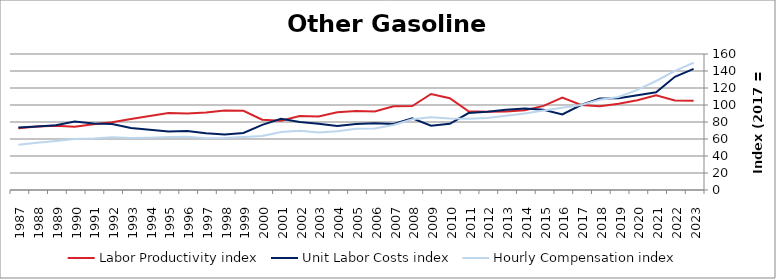
| Category | Labor Productivity index | Unit Labor Costs index | Hourly Compensation index |
|---|---|---|---|
| 2023.0 | 105.082 | 142.437 | 149.675 |
| 2022.0 | 105.326 | 133.145 | 140.236 |
| 2021.0 | 111.449 | 115.073 | 128.248 |
| 2020.0 | 105.673 | 111.532 | 117.858 |
| 2019.0 | 101.478 | 107.874 | 109.468 |
| 2018.0 | 98.571 | 107.612 | 106.075 |
| 2017.0 | 100 | 100 | 100 |
| 2016.0 | 108.844 | 88.969 | 96.837 |
| 2015.0 | 98.941 | 94.402 | 93.402 |
| 2014.0 | 93.907 | 95.83 | 89.99 |
| 2013.0 | 92.495 | 94.391 | 87.307 |
| 2012.0 | 92.034 | 92.161 | 84.819 |
| 2011.0 | 92.594 | 90.472 | 83.771 |
| 2010.0 | 107.949 | 77.886 | 84.077 |
| 2009.0 | 112.909 | 75.733 | 85.509 |
| 2008.0 | 98.693 | 84.287 | 83.185 |
| 2007.0 | 98.588 | 77.628 | 76.531 |
| 2006.0 | 92.355 | 78.432 | 72.437 |
| 2005.0 | 92.795 | 77.594 | 72.004 |
| 2004.0 | 91.543 | 75.391 | 69.015 |
| 2003.0 | 86.612 | 78.048 | 67.599 |
| 2002.0 | 86.943 | 80.029 | 69.58 |
| 2001.0 | 81.604 | 83.76 | 68.351 |
| 2000.0 | 82.723 | 76.671 | 63.424 |
| 1999.0 | 93.133 | 67.061 | 62.456 |
| 1998.0 | 93.453 | 65.383 | 61.103 |
| 1997.0 | 91.311 | 66.655 | 60.863 |
| 1996.0 | 90.084 | 69.382 | 62.502 |
| 1995.0 | 90.59 | 68.878 | 62.397 |
| 1994.0 | 87.033 | 70.768 | 61.591 |
| 1993.0 | 83.607 | 73.037 | 61.064 |
| 1992.0 | 79.728 | 77.707 | 61.954 |
| 1991.0 | 77.22 | 78.351 | 60.503 |
| 1990.0 | 74.522 | 80.59 | 60.057 |
| 1989.0 | 75.728 | 76.185 | 57.693 |
| 1988.0 | 74.614 | 74.634 | 55.688 |
| 1987.0 | 72.565 | 73.469 | 53.313 |